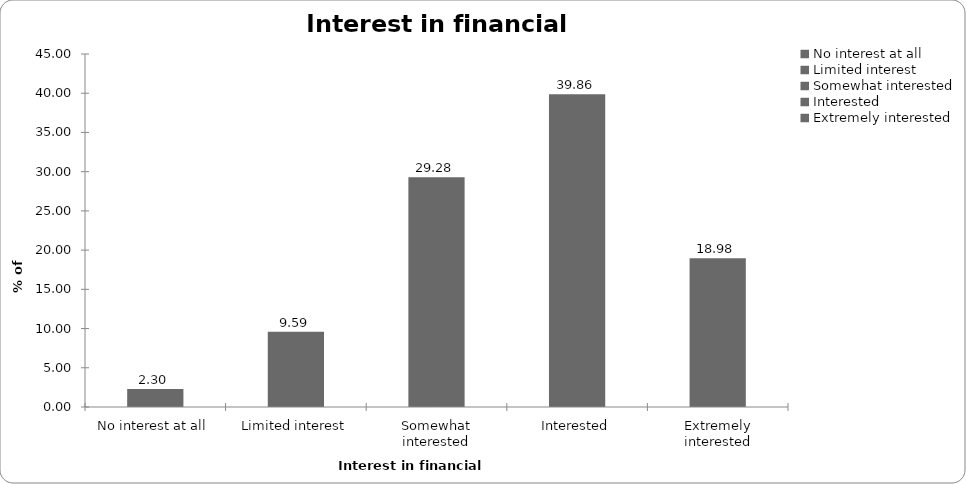
| Category | Interest in financial planning |
|---|---|
| No interest at all | 2.298 |
| Limited interest | 9.586 |
| Somewhat interested | 29.284 |
| Interested | 39.856 |
| Extremely interested | 18.976 |